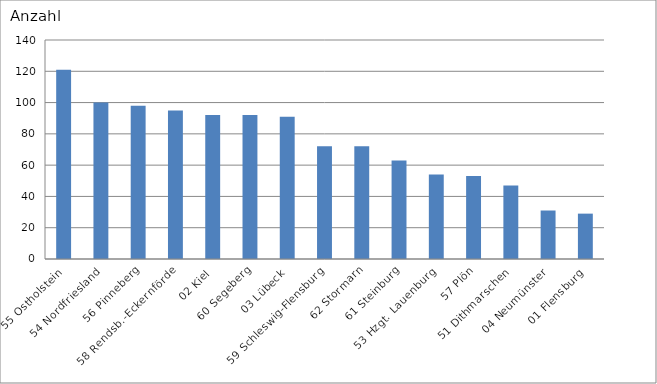
| Category | 55 Ostholstein 54 Nordfriesland 56 Pinneberg 58 Rendsb.-Eckernförde 02 Kiel 60 Segeberg 03 Lübeck 59 Schleswig-Flensburg 62 Stormarn 61 Steinburg 53 Hzgt. Lauenburg 57 Plön 51 Dithmarschen 04 Neumünster 01 Flensburg |
|---|---|
| 55 Ostholstein | 121 |
| 54 Nordfriesland | 100 |
| 56 Pinneberg | 98 |
| 58 Rendsb.-Eckernförde | 95 |
| 02 Kiel | 92 |
| 60 Segeberg | 92 |
| 03 Lübeck | 91 |
| 59 Schleswig-Flensburg | 72 |
| 62 Stormarn | 72 |
| 61 Steinburg | 63 |
| 53 Hzgt. Lauenburg | 54 |
| 57 Plön | 53 |
| 51 Dithmarschen | 47 |
| 04 Neumünster | 31 |
| 01 Flensburg | 29 |